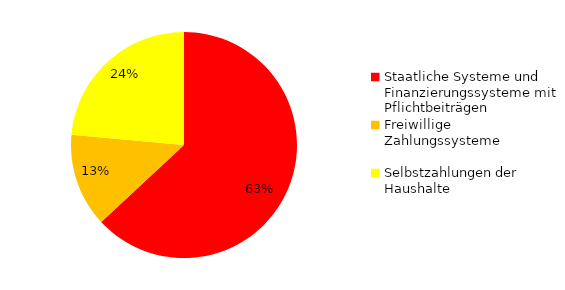
| Category | 2014 |
|---|---|
| Staatliche Systeme und Finanzierungssysteme mit Pflichtbeiträgen | 225630.499 |
| Freiwillige Zahlungssysteme | 47815.093 |
| Selbstzahlungen der Haushalte | 84240.734 |